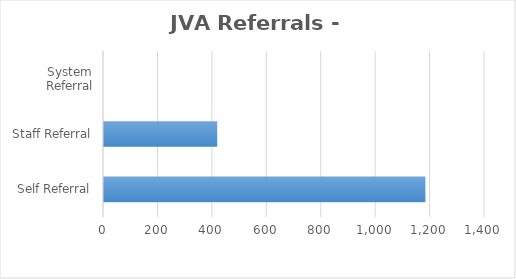
| Category | Series 0 |
|---|---|
| Self Referral | 1181 |
| Staff Referral | 416 |
| System Referral | 0 |